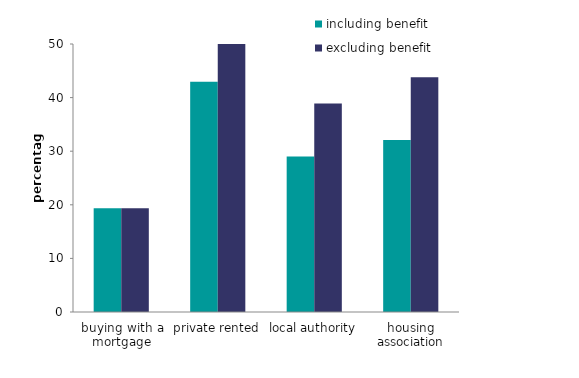
| Category | including benefit | excluding benefit |
|---|---|---|
| buying with a mortgage | 19.348 | 19.348 |
| private rented | 42.966 | 51.5 |
| local authority | 29.015 | 38.901 |
| housing association | 32.104 | 43.8 |